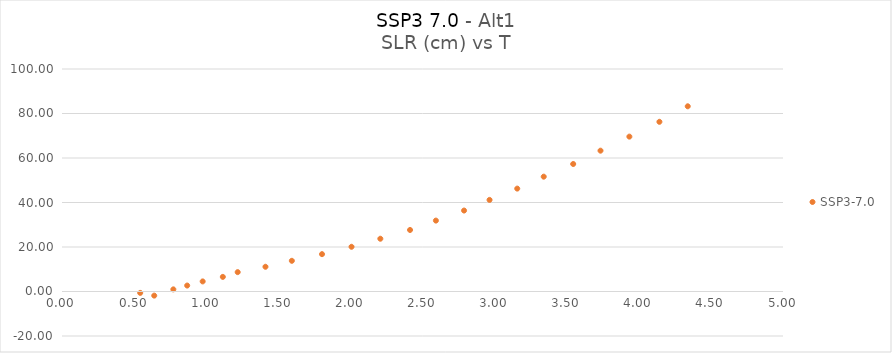
| Category | SSP3-7.0 |
|---|---|
| 0.639593181 | -1.853 |
| 0.542364652 | -0.626 |
| 0.772130534 | 0.958 |
| 0.868150926 | 2.678 |
| 0.975561417 | 4.531 |
| 1.115356613 | 6.565 |
| 1.218373475 | 8.703 |
| 1.410985436 | 11.118 |
| 1.593944848 | 13.794 |
| 1.803164946 | 16.789 |
| 2.007866221 | 20.098 |
| 2.207623083 | 23.715 |
| 2.413554456 | 27.657 |
| 2.592903574 | 31.868 |
| 2.788210632 | 36.385 |
| 2.964937005 | 41.166 |
| 3.15696926 | 46.247 |
| 3.340711123 | 51.609 |
| 3.545050632 | 57.303 |
| 3.734433966 | 63.293 |
| 3.934637593 | 69.606 |
| 4.14299073 | 76.265 |
| 4.339424848 | 83.24 |